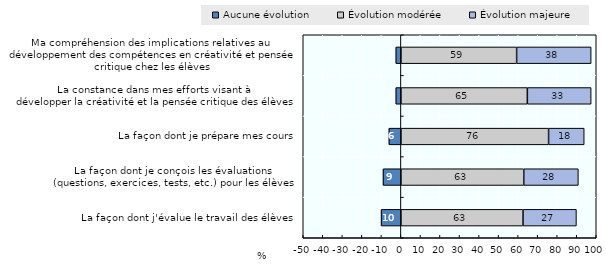
| Category | Aucune évolution | Évolution modérée | Évolution majeure |
|---|---|---|---|
| La façon dont j'évalue le travail des élèves | -10.147 | 62.506 | 27.347 |
| La façon dont je conçois les évaluations 
(questions, exercices, tests, etc.) pour les élèves | -9.163 | 62.887 | 27.949 |
| La façon dont je prépare mes cours | -6.163 | 75.597 | 18.24 |
| La constance dans mes efforts visant à 
développer la créativité et la pensée critique des élèves | -2.613 | 64.73 | 32.659 |
| Ma compréhension des implications relatives au 
développement des compétences en créativité et pensée critique chez les élèves | -2.613 | 59.244 | 38.143 |